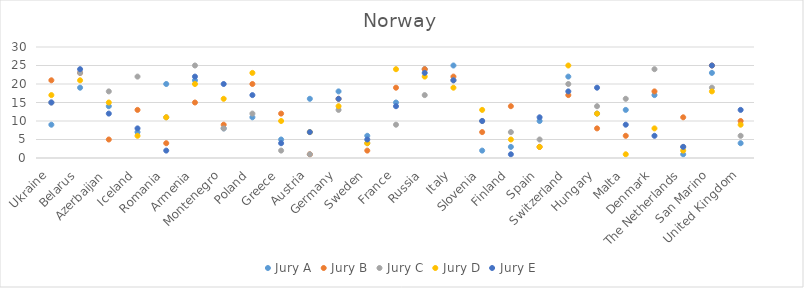
| Category | Jury A | Jury B | Jury C | Jury D | Jury E |
|---|---|---|---|---|---|
| Ukraine | 9 | 21 | 15 | 17 | 15 |
| Belarus | 19 | 23 | 23 | 21 | 24 |
| Azerbaijan | 14 | 5 | 18 | 15 | 12 |
| Iceland | 7 | 13 | 22 | 6 | 8 |
| Romania | 20 | 4 | 11 | 11 | 2 |
| Armenia | 21 | 15 | 25 | 20 | 22 |
| Montenegro | 8 | 9 | 8 | 16 | 20 |
| Poland | 11 | 20 | 12 | 23 | 17 |
| Greece | 5 | 12 | 2 | 10 | 4 |
| Austria | 16 | 1 | 1 | 7 | 7 |
| Germany | 18 | 16 | 13 | 14 | 16 |
| Sweden | 6 | 2 | 4 | 4 | 5 |
| France | 15 | 19 | 9 | 24 | 14 |
| Russia | 24 | 24 | 17 | 22 | 23 |
| Italy | 25 | 22 | 21 | 19 | 21 |
| Slovenia | 2 | 7 | 10 | 13 | 10 |
| Finland | 3 | 14 | 7 | 5 | 1 |
| Spain | 10 | 3 | 5 | 3 | 11 |
| Switzerland | 22 | 17 | 20 | 25 | 18 |
| Hungary | 12 | 8 | 14 | 12 | 19 |
| Malta | 13 | 6 | 16 | 1 | 9 |
| Denmark | 17 | 18 | 24 | 8 | 6 |
| The Netherlands | 1 | 11 | 3 | 2 | 3 |
| San Marino | 23 | 25 | 19 | 18 | 25 |
| United Kingdom | 4 | 10 | 6 | 9 | 13 |